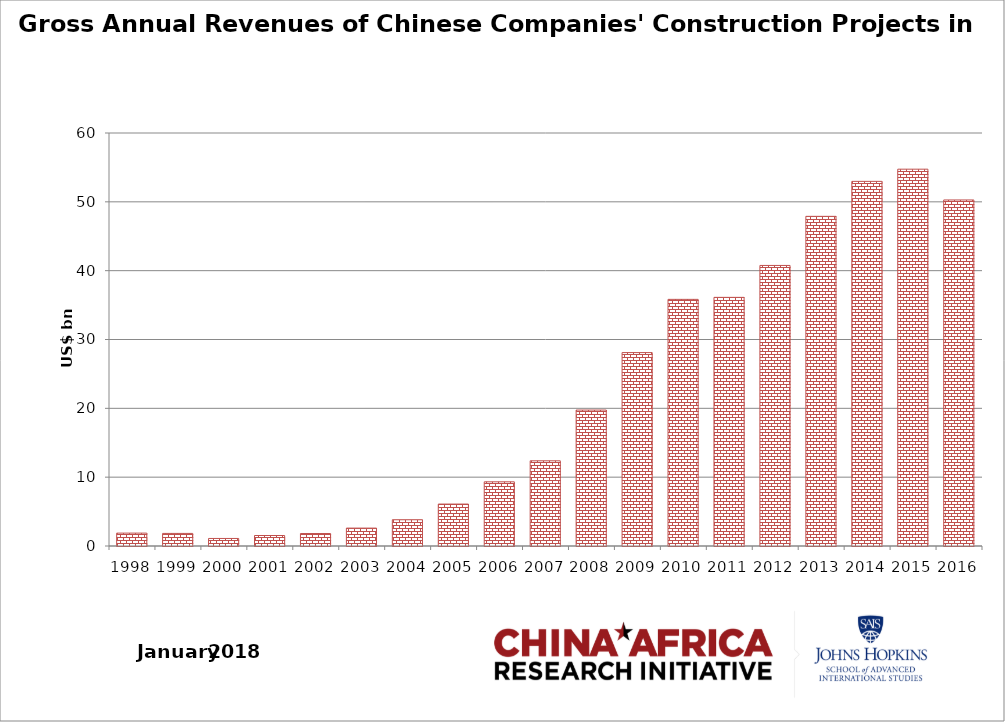
| Category | Series 0 |
|---|---|
| 1998.0 | 1.871 |
| 1999.0 | 1.828 |
| 2000.0 | 1.096 |
| 2001.0 | 1.524 |
| 2002.0 | 1.814 |
| 2003.0 | 2.601 |
| 2004.0 | 3.812 |
| 2005.0 | 6.092 |
| 2006.0 | 9.324 |
| 2007.0 | 12.376 |
| 2008.0 | 19.749 |
| 2009.0 | 28.099 |
| 2010.0 | 35.83 |
| 2011.0 | 36.122 |
| 2012.0 | 40.758 |
| 2013.0 | 47.891 |
| 2014.0 | 52.974 |
| 2015.0 | 54.744 |
| 2016.0 | 50.271 |